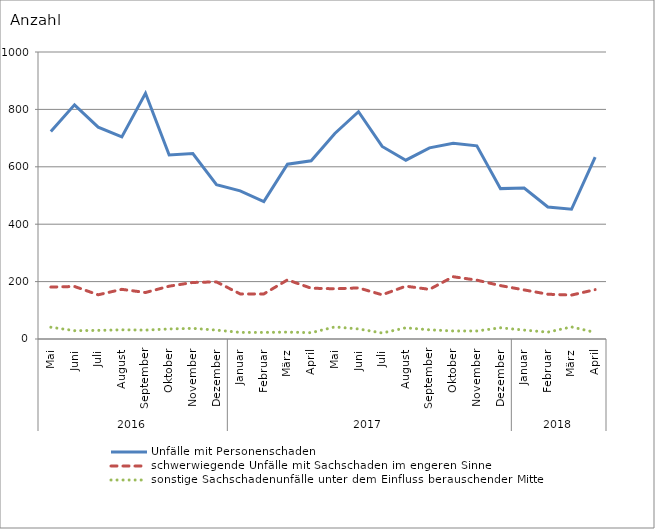
| Category | Unfälle mit Personenschaden | schwerwiegende Unfälle mit Sachschaden im engeren Sinne | sonstige Sachschadenunfälle unter dem Einfluss berauschender Mittel |
|---|---|---|---|
| 0 | 723 | 181 | 41 |
| 1 | 816 | 183 | 29 |
| 2 | 738 | 154 | 30 |
| 3 | 704 | 173 | 32 |
| 4 | 856 | 162 | 31 |
| 5 | 641 | 184 | 35 |
| 6 | 646 | 197 | 37 |
| 7 | 538 | 199 | 31 |
| 8 | 516 | 157 | 23 |
| 9 | 479 | 157 | 23 |
| 10 | 609 | 206 | 24 |
| 11 | 621 | 177 | 22 |
| 12 | 716 | 175 | 42 |
| 13 | 792 | 178 | 35 |
| 14 | 671 | 154 | 21 |
| 15 | 623 | 184 | 39 |
| 16 | 666 | 173 | 32 |
| 17 | 682 | 217 | 28 |
| 18 | 673 | 205 | 28 |
| 19 | 524 | 186 | 39 |
| 20 | 526 | 171 | 31 |
| 21 | 460 | 156 | 24 |
| 22 | 452 | 153 | 42 |
| 23 | 634 | 172 | 23 |